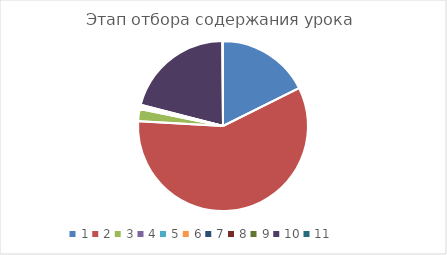
| Category | Series 0 |
|---|---|
| 0 | 0.177 |
| 1 | 0.584 |
| 2 | 0.023 |
| 3 | 0.001 |
| 4 | 0.001 |
| 5 | 0.001 |
| 6 | 0.001 |
| 7 | 0.001 |
| 8 | 0.001 |
| 9 | 0.209 |
| 10 | 0.001 |